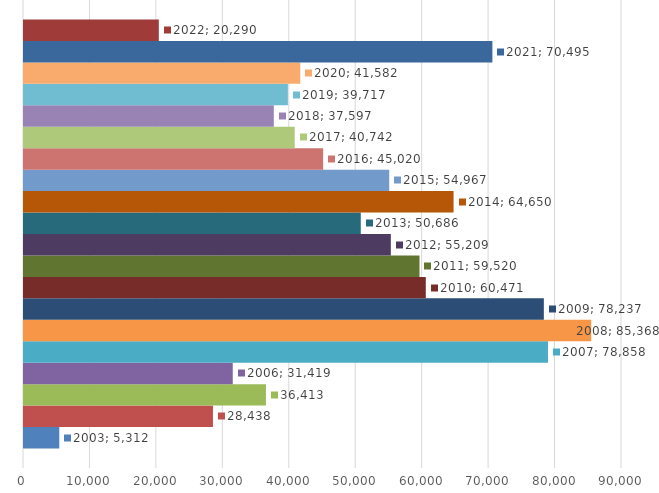
| Category | 2003 | 2004 | 2005 | 2006 | 2007 | 2008 | 2009 | 2010 | 2011 | 2012 | 2013 | 2014 | 2015 | 2016 | 2017 | 2018 | 2019 | 2020 | 2021 | 2022 |
|---|---|---|---|---|---|---|---|---|---|---|---|---|---|---|---|---|---|---|---|---|
| 0 | 5312 | 28438 | 36413 | 31419 | 78858 | 85368 | 78237 | 60471 | 59520 | 55209 | 50686 | 64650 | 54967 | 45020 | 40742 | 37597 | 39717 | 41582 | 70495 | 20290 |